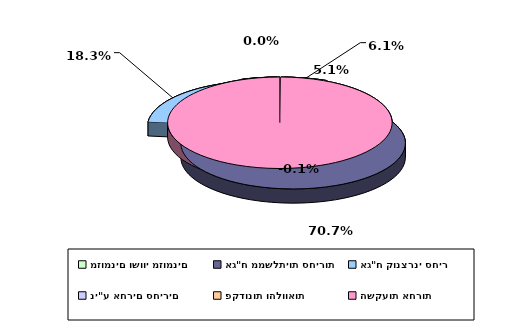
| Category | Series 0 |
|---|---|
| מזומנים ושווי מזומנים | 0.061 |
| אג"ח ממשלתיות סחירות | 0.707 |
| אג"ח קונצרני סחיר | 0.183 |
| ני"ע אחרים סחירים | 0.051 |
| פקדונות והלוואות | 0 |
| השקעות אחרות | -0.001 |